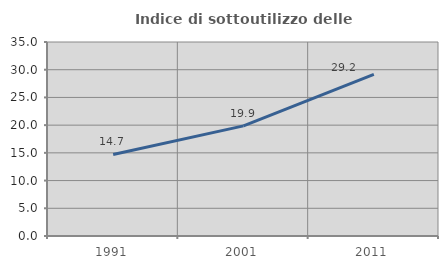
| Category | Indice di sottoutilizzo delle abitazioni  |
|---|---|
| 1991.0 | 14.72 |
| 2001.0 | 19.87 |
| 2011.0 | 29.168 |